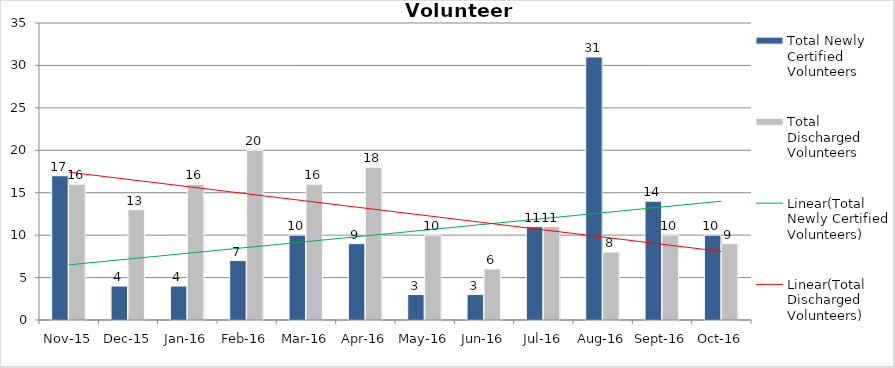
| Category | Total Newly Certified Volunteers | Total Discharged Volunteers |
|---|---|---|
| Nov-15 | 17 | 16 |
| Dec-15 | 4 | 13 |
| Jan-16 | 4 | 16 |
| Feb-16 | 7 | 20 |
| Mar-16 | 10 | 16 |
| Apr-16 | 9 | 18 |
| May-16 | 3 | 10 |
| Jun-16 | 3 | 6 |
| Jul-16 | 11 | 11 |
| Aug-16 | 31 | 8 |
| Sep-16 | 14 | 10 |
| Oct-16 | 10 | 9 |